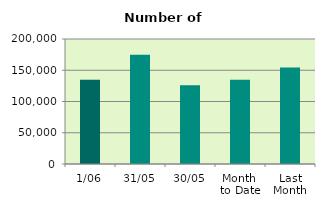
| Category | Series 0 |
|---|---|
| 1/06 | 134954 |
| 31/05 | 174640 |
| 30/05 | 125906 |
| Month 
to Date | 134954 |
| Last
Month | 154240.182 |